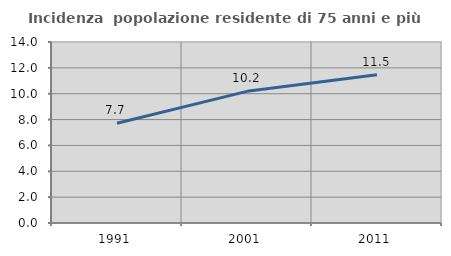
| Category | Incidenza  popolazione residente di 75 anni e più |
|---|---|
| 1991.0 | 7.713 |
| 2001.0 | 10.184 |
| 2011.0 | 11.461 |